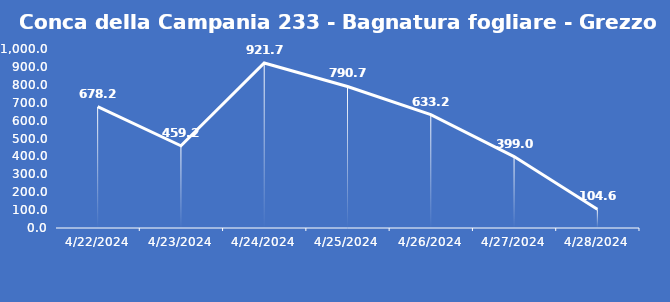
| Category | Conca della Campania 233 - Bagnatura fogliare - Grezzo (min) |
|---|---|
| 4/22/24 | 678.2 |
| 4/23/24 | 459.2 |
| 4/24/24 | 921.7 |
| 4/25/24 | 790.7 |
| 4/26/24 | 633.2 |
| 4/27/24 | 399 |
| 4/28/24 | 104.6 |